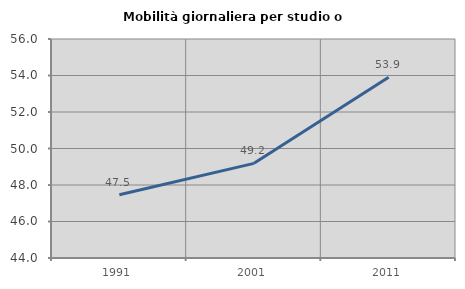
| Category | Mobilità giornaliera per studio o lavoro |
|---|---|
| 1991.0 | 47.467 |
| 2001.0 | 49.186 |
| 2011.0 | 53.901 |